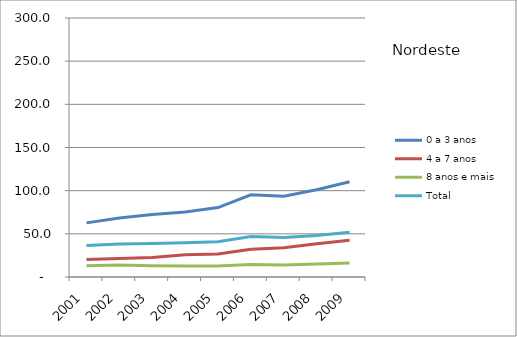
| Category | 0 a 3 anos | 4 a 7 anos | 8 anos e mais | Total |
|---|---|---|---|---|
| 2001.0 | 62.7 | 20.3 | 12.9 | 36.4 |
| 2002.0 | 68.3 | 21.4 | 13.8 | 38.3 |
| 2003.0 | 72.4 | 22.7 | 13 | 38.9 |
| 2004.0 | 75.3 | 25.7 | 12.6 | 39.7 |
| 2005.0 | 80.4 | 26.7 | 12.6 | 40.9 |
| 2006.0 | 95.2 | 32.1 | 14.4 | 47 |
| 2007.0 | 93.5 | 33.9 | 14 | 45.7 |
| 2008.0 | 101.1 | 38.4 | 15 | 48.1 |
| 2009.0 | 110.4 | 42.7 | 16.2 | 51.8 |